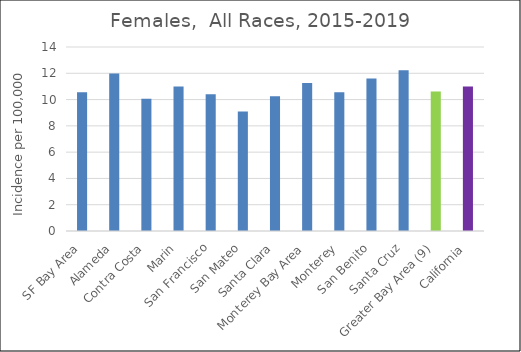
| Category | Female |
|---|---|
| SF Bay Area | 10.56 |
|   Alameda | 11.99 |
|   Contra Costa | 10.06 |
|   Marin | 10.99 |
|   San Francisco | 10.41 |
|   San Mateo | 9.1 |
|   Santa Clara | 10.26 |
| Monterey Bay Area | 11.27 |
|   Monterey | 10.55 |
|   San Benito | 11.6 |
|   Santa Cruz | 12.24 |
| Greater Bay Area (9) | 10.62 |
| California | 11 |